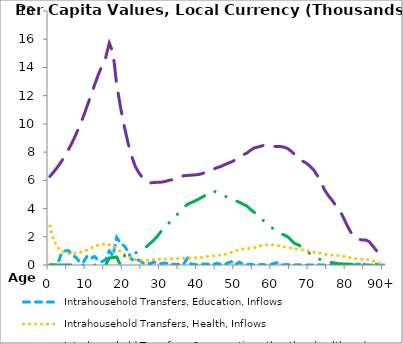
| Category | Intrahousehold Transfers, Education, Inflows | Intrahousehold Transfers, Health, Inflows | Intrahousehold Transfers, Consumption other than health and education, Inflows | Intrahousehold Transfers, Saving, Inflows |
|---|---|---|---|---|
| 0 | 0 | 2762.394 | 6279.168 | 0 |
|  | 0 | 1786.02 | 6589.035 | 0 |
| 2 | 0 | 1290.166 | 6916.805 | 0 |
| 3 | 734.259 | 1009.462 | 7288.937 | 0 |
| 4 | 995.74 | 858.436 | 7705.695 | 0 |
| 5 | 1021.189 | 800.831 | 8169.004 | 0 |
| 6 | 699.302 | 793.837 | 8672.164 | 0 |
| 7 | 539.855 | 830.525 | 9238.274 | 0 |
| 8 | 229.674 | 885.368 | 9834.684 | 0 |
| 9 | 179.512 | 965.99 | 10501.987 | 0 |
| 10 | 614.867 | 1060.745 | 11236.667 | 0 |
| 11 | 461.048 | 1173.455 | 11981.09 | 0 |
| 12 | 605.559 | 1293.108 | 12732.558 | 0 |
| 13 | 350.342 | 1405.219 | 13459.272 | 0 |
| 14 | 238.701 | 1468.139 | 14094.956 | 0 |
| 15 | 375.314 | 1480.328 | 14674.531 | 0 |
| 16 | 985.287 | 1441.419 | 15723.248 | 496.014 |
| 17 | 660.385 | 1330.998 | 15067.206 | 529.146 |
| 18 | 1946.911 | 1158.419 | 12771.045 | 564.493 |
| 19 | 1535.303 | 952.952 | 11221.318 | 0 |
| 20 | 1374.188 | 763.439 | 9871.645 | 640.892 |
| 21 | 961.668 | 599.878 | 8700.36 | 688.714 |
| 22 | 406.99 | 475.706 | 7737 | 747.639 |
| 23 | 287.826 | 394.348 | 6978.29 | 847.685 |
| 24 | 355.778 | 353.218 | 6518.093 | 967.071 |
| 25 | 151.771 | 331.5 | 6165.827 | 1091.977 |
| 26 | 139.35 | 327.881 | 5937.557 | 1295.473 |
| 27 | 100.248 | 345.446 | 5811.401 | 1528.538 |
| 28 | 213.755 | 381.438 | 5851.359 | 1765.376 |
| 29 | 140.523 | 402.959 | 5858.32 | 2048.43 |
| 30 | 109.805 | 421.341 | 5872.911 | 2413.123 |
| 31 | 146.166 | 433.498 | 5911.845 | 2695.545 |
| 32 | 105.355 | 434.073 | 5994.898 | 2958.513 |
| 33 | 54.815 | 430.897 | 6052.148 | 3226.859 |
| 34 | 38.241 | 443.079 | 6127.907 | 3490.978 |
| 35 | 61.456 | 465.049 | 6234.473 | 3794.284 |
| 36 | 62.538 | 475.68 | 6322.828 | 4067.425 |
| 37 | 458.791 | 488.584 | 6346.738 | 4284.423 |
| 38 | 64.203 | 499.014 | 6367.873 | 4412.054 |
| 39 | 37.953 | 503.665 | 6380.088 | 4532.982 |
| 40 | 11.056 | 513.089 | 6411.442 | 4663.913 |
| 41 | 56.769 | 548.109 | 6477.496 | 4802.235 |
| 42 | 73.29 | 584.456 | 6585.208 | 4960.542 |
| 43 | 43.411 | 617.187 | 6670.893 | 5148.455 |
| 44 | 43.62 | 646.126 | 6787.061 | 5244.223 |
| 45 | 122.965 | 673.256 | 6894.385 | 5151.991 |
| 46 | 54.312 | 694.391 | 6978.105 | 5038.785 |
| 47 | 31.935 | 734.872 | 7103.507 | 4904.4 |
| 48 | 159.704 | 815.647 | 7213.895 | 4775.666 |
| 49 | 235.482 | 904.332 | 7316.437 | 4647.399 |
| 50 | 32.047 | 1004.178 | 7458.014 | 4546.544 |
| 51 | 200.686 | 1078.551 | 7650.601 | 4453.179 |
| 52 | 73.536 | 1128.839 | 7796.929 | 4310.455 |
| 53 | 19.437 | 1154.372 | 7925.881 | 4186.976 |
| 54 | 55.239 | 1188.515 | 8122.838 | 3942.363 |
| 55 | 20.392 | 1229.582 | 8297.289 | 3733.673 |
| 56 | 14.577 | 1303.019 | 8357.908 | 3558.804 |
| 57 | 36.628 | 1381.899 | 8437.506 | 3271.586 |
| 58 | 19.553 | 1432.072 | 8500.628 | 3008.205 |
| 59 | 23.493 | 1435.693 | 8457.877 | 2762.027 |
| 60 | 85.15 | 1426.408 | 8401.269 | 2594.019 |
| 61 | 164.575 | 1391.337 | 8402.714 | 2420.051 |
| 62 | 20.906 | 1337.83 | 8396.317 | 2276.419 |
| 63 | 11.387 | 1282.405 | 8356.521 | 2137.833 |
| 64 | 40.868 | 1245.753 | 8254.076 | 2007.158 |
| 65 | 6.853 | 1201.788 | 8061.105 | 1743.268 |
| 66 | 2.799 | 1152.04 | 7806.793 | 1509.239 |
| 67 | 15.11 | 1108.297 | 7585.612 | 1422.296 |
| 68 | 7.302 | 1068.066 | 7362.389 | 1188.814 |
| 69 | 3.527 | 1023.847 | 7221.253 | 967.123 |
| 70 | 4.3 | 968.049 | 7009.292 | 807.558 |
| 71 | 11.44 | 922.653 | 6753.557 | 634.47 |
| 72 | 12.106 | 868.511 | 6342.627 | 475.355 |
| 73 | 7.068 | 809.853 | 5848.027 | 369.498 |
| 74 | 1.801 | 757.503 | 5303.12 | 286.74 |
| 75 | 1.147 | 728.094 | 4912.758 | 219.304 |
| 76 | 3.052 | 699.192 | 4580.763 | 166.655 |
| 77 | 6.542 | 680.16 | 4211.701 | 122.552 |
| 78 | 3.171 | 661.688 | 3871.344 | 90.339 |
| 79 | 31.318 | 619.656 | 3378.952 | 73.371 |
| 80 | 4.433 | 566.555 | 2819.668 | 64.45 |
| 81 | 0.154 | 503.215 | 2328.004 | 57.225 |
| 82 | 5.48 | 456.157 | 2054.051 | 53.638 |
| 83 | 65.989 | 415.994 | 1814.122 | 53.557 |
| 84 | 0 | 418.562 | 1780.279 | 51.983 |
| 85 | 0.141 | 406.067 | 1778.74 | 49.706 |
| 86 | 0.182 | 365.98 | 1648.873 | 49.552 |
| 87 | 3.136 | 278.018 | 1326.981 | 51.609 |
| 88 | 15.398 | 180.876 | 998.952 | 57.877 |
| 89 | 0 | 97.21 | 736.948 | 66.371 |
| 90+ | 0 | 52.245 | 611.56 | 76.112 |